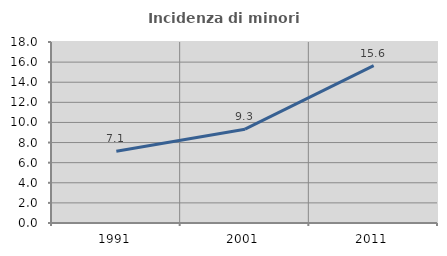
| Category | Incidenza di minori stranieri |
|---|---|
| 1991.0 | 7.143 |
| 2001.0 | 9.333 |
| 2011.0 | 15.644 |